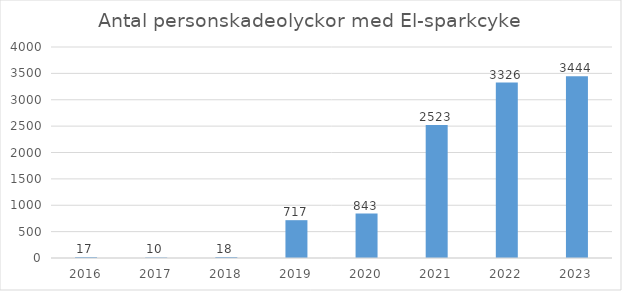
| Category | Total |
|---|---|
| 2016.0 | 17 |
| 2017.0 | 10 |
| 2018.0 | 18 |
| 2019.0 | 717 |
| 2020.0 | 843 |
| 2021.0 | 2523 |
| 2022.0 | 3326 |
| 2023.0 | 3444 |